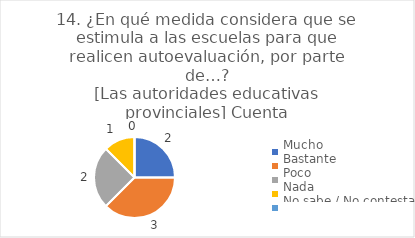
| Category | 14. ¿En qué medida considera que se estimula a las escuelas para que realicen autoevaluación, por parte de…?
[Las autoridades educativas provinciales] |
|---|---|
| Mucho  | 0.25 |
| Bastante  | 0.375 |
| Poco  | 0.25 |
| Nada  | 0.125 |
| No sabe / No contesta | 0 |